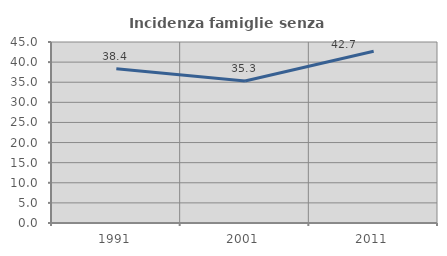
| Category | Incidenza famiglie senza nuclei |
|---|---|
| 1991.0 | 38.356 |
| 2001.0 | 35.294 |
| 2011.0 | 42.697 |